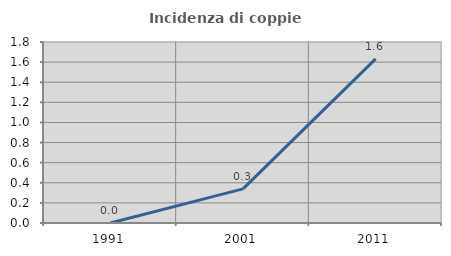
| Category | Incidenza di coppie miste |
|---|---|
| 1991.0 | 0 |
| 2001.0 | 0.339 |
| 2011.0 | 1.633 |